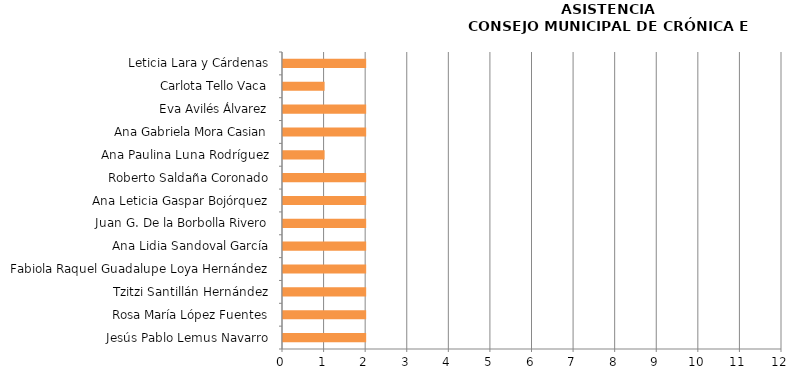
| Category | Series 0 |
|---|---|
| Jesús Pablo Lemus Navarro | 2 |
| Rosa María López Fuentes | 2 |
| Tzitzi Santillán Hernández | 2 |
| Fabiola Raquel Guadalupe Loya Hernández | 2 |
| Ana Lidia Sandoval García | 2 |
| Juan G. De la Borbolla Rivero | 2 |
| Ana Leticia Gaspar Bojórquez | 2 |
| Roberto Saldaña Coronado | 2 |
| Ana Paulina Luna Rodríguez | 1 |
| Ana Gabriela Mora Casian | 2 |
| Eva Avilés Álvarez | 2 |
| Carlota Tello Vaca | 1 |
| Leticia Lara y Cárdenas | 2 |